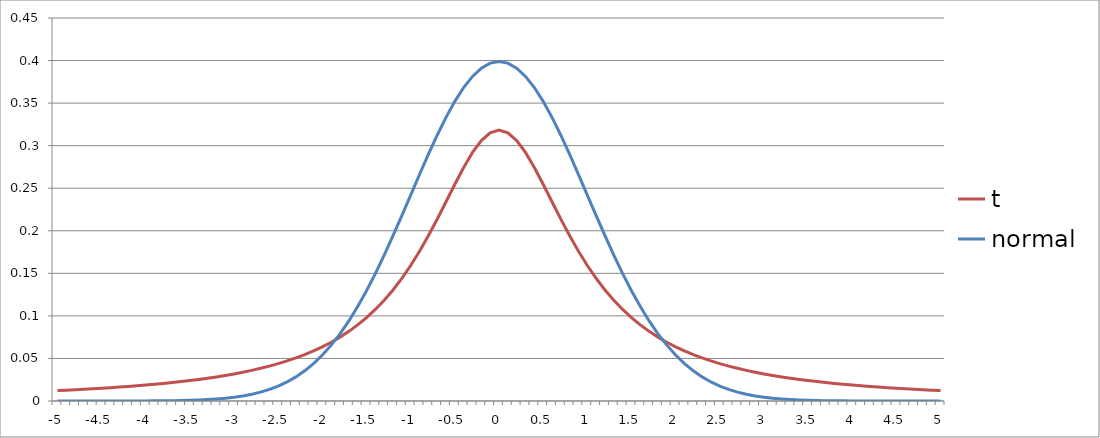
| Category | t | normal |
|---|---|---|
| -5.0 | 0.012 | 0 |
| -4.9 | 0.013 | 0 |
| -4.8 | 0.013 | 0 |
| -4.7 | 0.014 | 0 |
| -4.6 | 0.014 | 0 |
| -4.5 | 0.015 | 0 |
| -4.4 | 0.016 | 0 |
| -4.3 | 0.016 | 0 |
| -4.2 | 0.017 | 0 |
| -4.1 | 0.018 | 0 |
| -4.0 | 0.019 | 0 |
| -3.9 | 0.02 | 0 |
| -3.8 | 0.021 | 0 |
| -3.7 | 0.022 | 0 |
| -3.6 | 0.023 | 0.001 |
| -3.50000000000001 | 0.024 | 0.001 |
| -3.40000000000001 | 0.025 | 0.001 |
| -3.30000000000001 | 0.027 | 0.002 |
| -3.20000000000001 | 0.028 | 0.002 |
| -3.10000000000001 | 0.03 | 0.003 |
| -3.00000000000001 | 0.032 | 0.004 |
| -2.90000000000001 | 0.034 | 0.006 |
| -2.80000000000001 | 0.036 | 0.008 |
| -2.70000000000001 | 0.038 | 0.01 |
| -2.60000000000001 | 0.041 | 0.014 |
| -2.50000000000001 | 0.044 | 0.018 |
| -2.40000000000001 | 0.047 | 0.022 |
| -2.30000000000001 | 0.051 | 0.028 |
| -2.20000000000001 | 0.055 | 0.035 |
| -2.10000000000001 | 0.059 | 0.044 |
| -2.00000000000001 | 0.064 | 0.054 |
| -1.90000000000001 | 0.069 | 0.066 |
| -1.80000000000001 | 0.075 | 0.079 |
| -1.70000000000001 | 0.082 | 0.094 |
| -1.60000000000001 | 0.089 | 0.111 |
| -1.50000000000001 | 0.098 | 0.13 |
| -1.40000000000001 | 0.108 | 0.15 |
| -1.30000000000001 | 0.118 | 0.171 |
| -1.20000000000001 | 0.13 | 0.194 |
| -1.10000000000001 | 0.144 | 0.218 |
| -1.00000000000001 | 0.159 | 0.242 |
| -0.90000000000001 | 0.176 | 0.266 |
| -0.80000000000001 | 0.194 | 0.29 |
| -0.70000000000002 | 0.214 | 0.312 |
| -0.60000000000002 | 0.234 | 0.333 |
| -0.50000000000002 | 0.255 | 0.352 |
| -0.40000000000002 | 0.274 | 0.368 |
| -0.30000000000002 | 0.292 | 0.381 |
| -0.20000000000002 | 0.306 | 0.391 |
| -0.10000000000002 | 0.315 | 0.397 |
| 0.0 | 0.318 | 0.399 |
| 0.0999999999999801 | 0.315 | 0.397 |
| 0.19999999999998 | 0.306 | 0.391 |
| 0.29999999999998 | 0.292 | 0.381 |
| 0.39999999999998 | 0.274 | 0.368 |
| 0.49999999999998 | 0.255 | 0.352 |
| 0.59999999999998 | 0.234 | 0.333 |
| 0.69999999999998 | 0.214 | 0.312 |
| 0.79999999999998 | 0.194 | 0.29 |
| 0.89999999999998 | 0.176 | 0.266 |
| 0.99999999999998 | 0.159 | 0.242 |
| 1.09999999999998 | 0.144 | 0.218 |
| 1.19999999999998 | 0.13 | 0.194 |
| 1.29999999999998 | 0.118 | 0.171 |
| 1.39999999999998 | 0.108 | 0.15 |
| 1.49999999999998 | 0.098 | 0.13 |
| 1.59999999999998 | 0.089 | 0.111 |
| 1.69999999999998 | 0.082 | 0.094 |
| 1.79999999999998 | 0.075 | 0.079 |
| 1.89999999999998 | 0.069 | 0.066 |
| 1.99999999999998 | 0.064 | 0.054 |
| 2.09999999999997 | 0.059 | 0.044 |
| 2.19999999999997 | 0.055 | 0.035 |
| 2.29999999999997 | 0.051 | 0.028 |
| 2.39999999999997 | 0.047 | 0.022 |
| 2.49999999999997 | 0.044 | 0.018 |
| 2.59999999999997 | 0.041 | 0.014 |
| 2.69999999999997 | 0.038 | 0.01 |
| 2.79999999999997 | 0.036 | 0.008 |
| 2.89999999999997 | 0.034 | 0.006 |
| 2.99999999999997 | 0.032 | 0.004 |
| 3.09999999999997 | 0.03 | 0.003 |
| 3.19999999999997 | 0.028 | 0.002 |
| 3.29999999999997 | 0.027 | 0.002 |
| 3.39999999999997 | 0.025 | 0.001 |
| 3.49999999999997 | 0.024 | 0.001 |
| 3.59999999999997 | 0.023 | 0.001 |
| 3.69999999999997 | 0.022 | 0 |
| 3.79999999999997 | 0.021 | 0 |
| 3.89999999999997 | 0.02 | 0 |
| 3.99999999999997 | 0.019 | 0 |
| 4.09999999999997 | 0.018 | 0 |
| 4.19999999999997 | 0.017 | 0 |
| 4.29999999999997 | 0.016 | 0 |
| 4.39999999999997 | 0.016 | 0 |
| 4.49999999999997 | 0.015 | 0 |
| 4.59999999999997 | 0.014 | 0 |
| 4.69999999999997 | 0.014 | 0 |
| 4.79999999999997 | 0.013 | 0 |
| 4.89999999999996 | 0.013 | 0 |
| 4.99999999999996 | 0.012 | 0 |